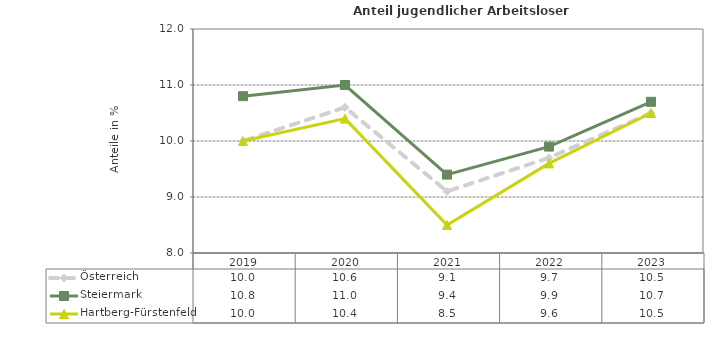
| Category | Österreich | Steiermark | Hartberg-Fürstenfeld |
|---|---|---|---|
| 2023.0 | 10.5 | 10.7 | 10.5 |
| 2022.0 | 9.7 | 9.9 | 9.6 |
| 2021.0 | 9.1 | 9.4 | 8.5 |
| 2020.0 | 10.6 | 11 | 10.4 |
| 2019.0 | 10 | 10.8 | 10 |